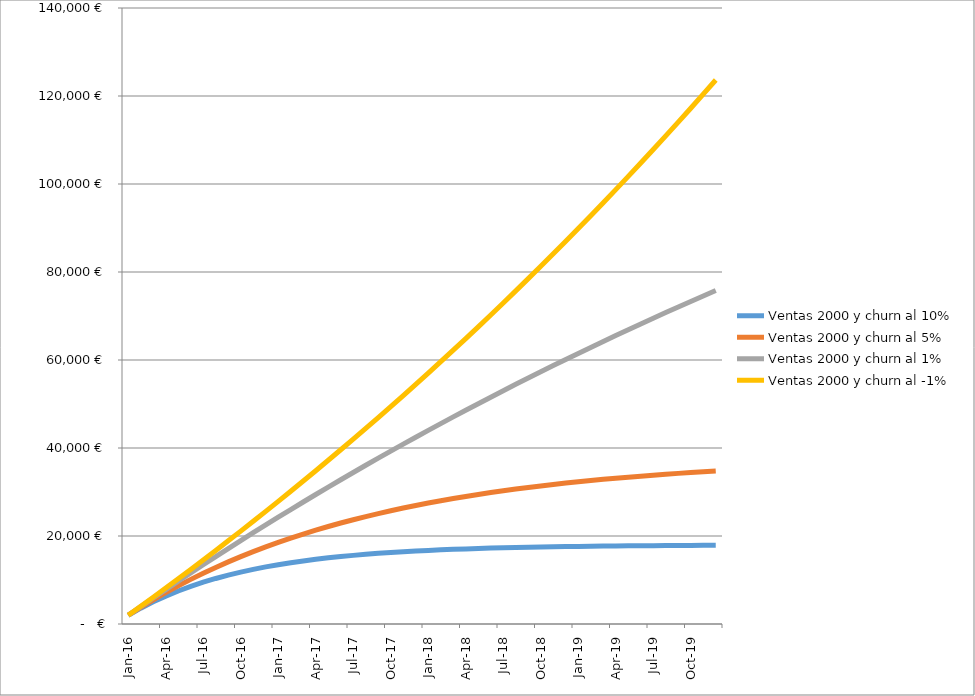
| Category | Ventas 2000 y churn al 10% | Ventas 2000 y churn al 5% | Ventas 2000 y churn al 1% | Ventas 2000 y churn al -1% |
|---|---|---|---|---|
| 2016-01-01 | 2000 | 2000 | 2000 | 2000 |
| 2016-02-01 | 3600 | 3800 | 3960 | 4040 |
| 2016-03-01 | 5040 | 5510 | 5900.4 | 6100.4 |
| 2016-04-01 | 6336 | 7134.5 | 7821.396 | 8181.404 |
| 2016-05-01 | 7502.4 | 8677.775 | 9723.182 | 10283.218 |
| 2016-06-01 | 8552.16 | 10143.886 | 11605.95 | 12406.05 |
| 2016-07-01 | 9496.944 | 11536.692 | 13469.891 | 14550.111 |
| 2016-08-01 | 10347.25 | 12859.857 | 15315.192 | 16715.612 |
| 2016-09-01 | 11112.525 | 14116.864 | 17142.04 | 18902.768 |
| 2016-10-01 | 11801.272 | 15311.021 | 18950.619 | 21111.796 |
| 2016-11-01 | 12421.145 | 16445.47 | 20741.113 | 23342.914 |
| 2016-12-01 | 12979.03 | 17523.197 | 22513.702 | 25596.343 |
| 2017-01-01 | 13481.127 | 18547.037 | 24268.565 | 27872.306 |
| 2017-02-01 | 13933.015 | 19519.685 | 26005.879 | 30171.029 |
| 2017-03-01 | 14339.713 | 20443.701 | 27725.821 | 32492.74 |
| 2017-04-01 | 14705.742 | 21321.516 | 29428.562 | 34837.667 |
| 2017-05-01 | 15035.168 | 22155.44 | 31114.277 | 37206.044 |
| 2017-06-01 | 15331.651 | 22947.668 | 32783.134 | 39598.104 |
| 2017-07-01 | 15598.486 | 23700.285 | 34435.303 | 42014.085 |
| 2017-08-01 | 15838.637 | 24415.27 | 36070.95 | 44454.226 |
| 2017-09-01 | 16054.774 | 25094.507 | 37690.24 | 46918.768 |
| 2017-10-01 | 16249.296 | 25739.781 | 39293.338 | 49407.956 |
| 2017-11-01 | 16424.367 | 26352.792 | 40880.404 | 51922.035 |
| 2017-12-01 | 16581.93 | 26935.153 | 42451.6 | 54461.256 |
| 2018-01-01 | 16723.737 | 27488.395 | 44007.084 | 57025.868 |
| 2018-02-01 | 16851.363 | 28013.975 | 45547.014 | 59616.127 |
| 2018-03-01 | 16966.227 | 28513.277 | 47071.543 | 62232.288 |
| 2018-04-01 | 17069.604 | 28987.613 | 48580.828 | 64874.611 |
| 2018-05-01 | 17162.644 | 29438.232 | 50075.02 | 67543.357 |
| 2018-06-01 | 17246.379 | 29866.321 | 51554.27 | 70238.791 |
| 2018-07-01 | 17321.741 | 30273.004 | 53018.727 | 72961.179 |
| 2018-08-01 | 17389.567 | 30659.354 | 54468.54 | 75710.791 |
| 2018-09-01 | 17450.611 | 31026.387 | 55903.854 | 78487.898 |
| 2018-10-01 | 17505.55 | 31375.067 | 57324.816 | 81292.777 |
| 2018-11-01 | 17554.995 | 31706.314 | 58731.567 | 84125.705 |
| 2018-12-01 | 17599.495 | 32020.998 | 60124.252 | 86986.962 |
| 2019-01-01 | 17639.546 | 32319.948 | 61503.009 | 89876.832 |
| 2019-02-01 | 17675.591 | 32603.951 | 62867.979 | 92795.6 |
| 2019-03-01 | 17708.032 | 32873.753 | 64219.299 | 95743.556 |
| 2019-04-01 | 17737.229 | 33130.066 | 65557.106 | 98720.992 |
| 2019-05-01 | 17763.506 | 33373.562 | 66881.535 | 101728.202 |
| 2019-06-01 | 17787.155 | 33604.884 | 68192.72 | 104765.484 |
| 2019-07-01 | 17808.44 | 33824.64 | 69490.793 | 107833.139 |
| 2019-08-01 | 17827.596 | 34033.408 | 70775.885 | 110931.47 |
| 2019-09-01 | 17844.836 | 34231.738 | 72048.126 | 114060.785 |
| 2019-10-01 | 17860.353 | 34420.151 | 73307.645 | 117221.392 |
| 2019-11-01 | 17874.317 | 34599.143 | 74554.568 | 120413.606 |
| 2019-12-01 | 17886.886 | 34769.186 | 75789.023 | 123637.742 |